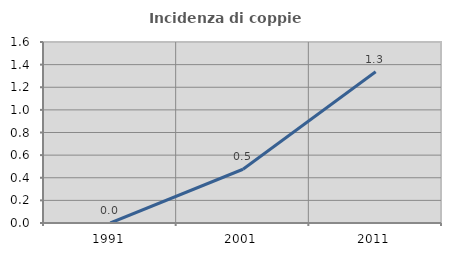
| Category | Incidenza di coppie miste |
|---|---|
| 1991.0 | 0 |
| 2001.0 | 0.475 |
| 2011.0 | 1.336 |